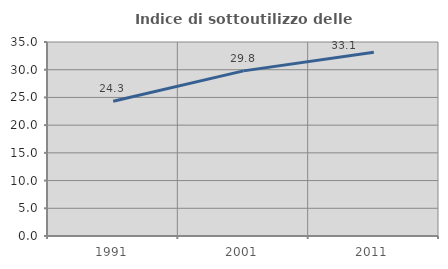
| Category | Indice di sottoutilizzo delle abitazioni  |
|---|---|
| 1991.0 | 24.307 |
| 2001.0 | 29.789 |
| 2011.0 | 33.146 |